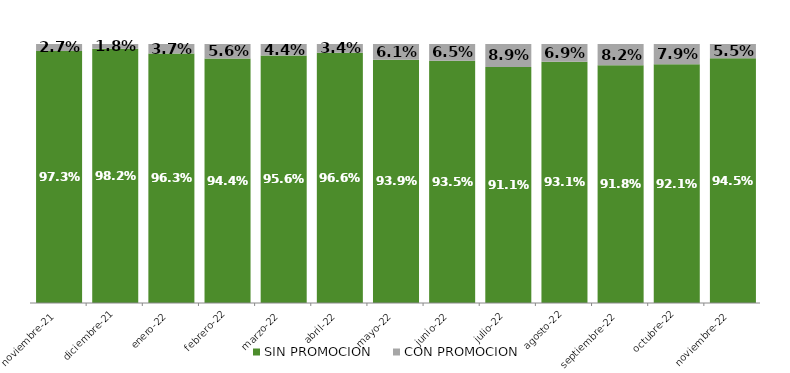
| Category | SIN PROMOCION   | CON PROMOCION   |
|---|---|---|
| 2021-11-01 | 0.973 | 0.027 |
| 2021-12-01 | 0.982 | 0.018 |
| 2022-01-01 | 0.963 | 0.037 |
| 2022-02-01 | 0.944 | 0.056 |
| 2022-03-01 | 0.956 | 0.044 |
| 2022-04-01 | 0.966 | 0.034 |
| 2022-05-01 | 0.939 | 0.061 |
| 2022-06-01 | 0.935 | 0.065 |
| 2022-07-01 | 0.911 | 0.089 |
| 2022-08-01 | 0.931 | 0.069 |
| 2022-09-01 | 0.918 | 0.082 |
| 2022-10-01 | 0.921 | 0.079 |
| 2022-11-01 | 0.945 | 0.055 |